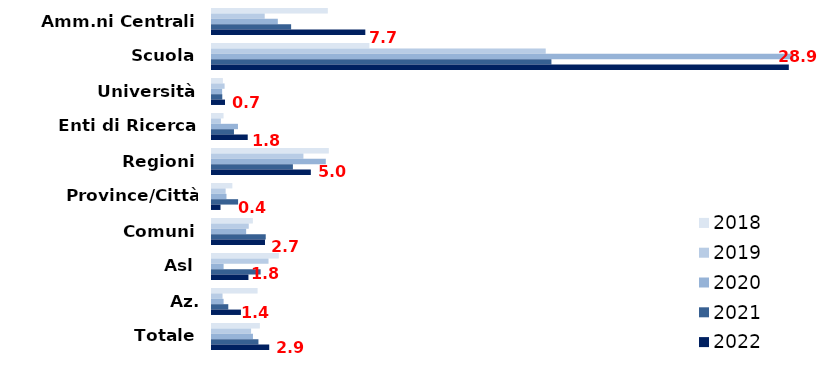
| Category | 2018 | 2019 | 2020 | 2021 | 2022 |
|---|---|---|---|---|---|
| Amm.ni Centrali | 5.8 | 2.64 | 3.296 | 3.963 | 7.679 |
| Scuola | 7.882 | 16.714 | 29.125 | 17 | 28.889 |
| Università | 0.545 | 0.631 | 0.508 | 0.515 | 0.652 |
| Enti di Ricerca | 0.579 | 0.444 | 1.3 | 1.1 | 1.789 |
| Regioni | 5.85 | 4.579 | 5.7 | 4.053 | 4.95 |
| Province/Città Metrop. | 1.02 | 0.683 | 0.725 | 1.307 | 0.426 |
| Comuni | 2.047 | 1.841 | 1.71 | 2.692 | 2.654 |
| Asl | 3.347 | 2.83 | 0.582 | 2.434 | 1.825 |
| Az. Ospedaliere/Irccs | 2.284 | 0.527 | 0.581 | 0.816 | 1.447 |
| Totale | 2.398 | 1.958 | 2.051 | 2.326 | 2.867 |